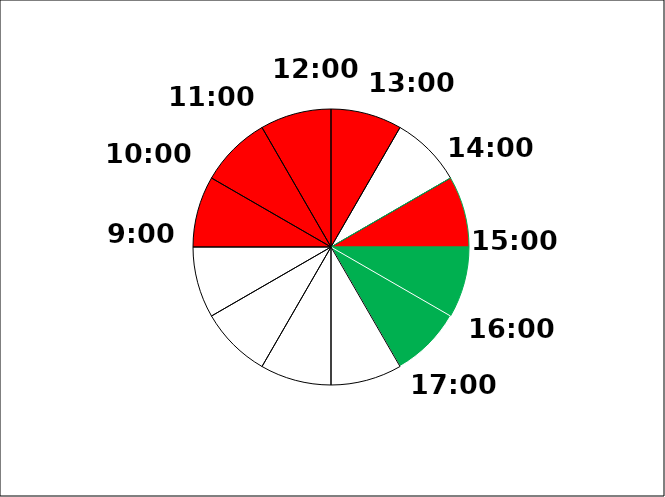
| Category | Series 0 |
|---|---|
| 0 | 1 |
| 1 | 1 |
| 2 | 1 |
| 3 | 1 |
| 4 | 1 |
| 5 | 1 |
| 6 | 1 |
| 7 | 1 |
| 8 | 1 |
| 9 | 1 |
| 10 | 1 |
| 11 | 1 |